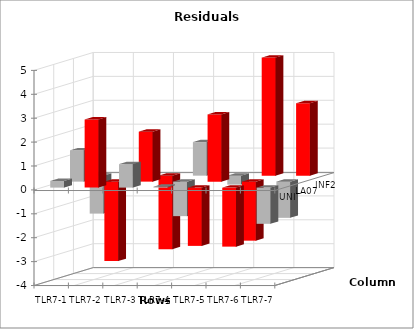
| Category | UNI | LA07 | INF2 |
|---|---|---|---|
| TLR7-1 | 0.277 | 1.31 | -1.587 |
| TLR7-2 | 2.851 | -3.322 | 0.472 |
| TLR7-3 | 0.984 | 2.091 | -3.075 |
| TLR7-4 | 0.038 | -1.443 | 1.405 |
| TLR7-5 | -2.438 | 2.813 | -0.375 |
| TLR7-6 | -2.469 | -2.469 | 4.939 |
| TLR7-7 | -1.515 | -1.515 | 3.029 |